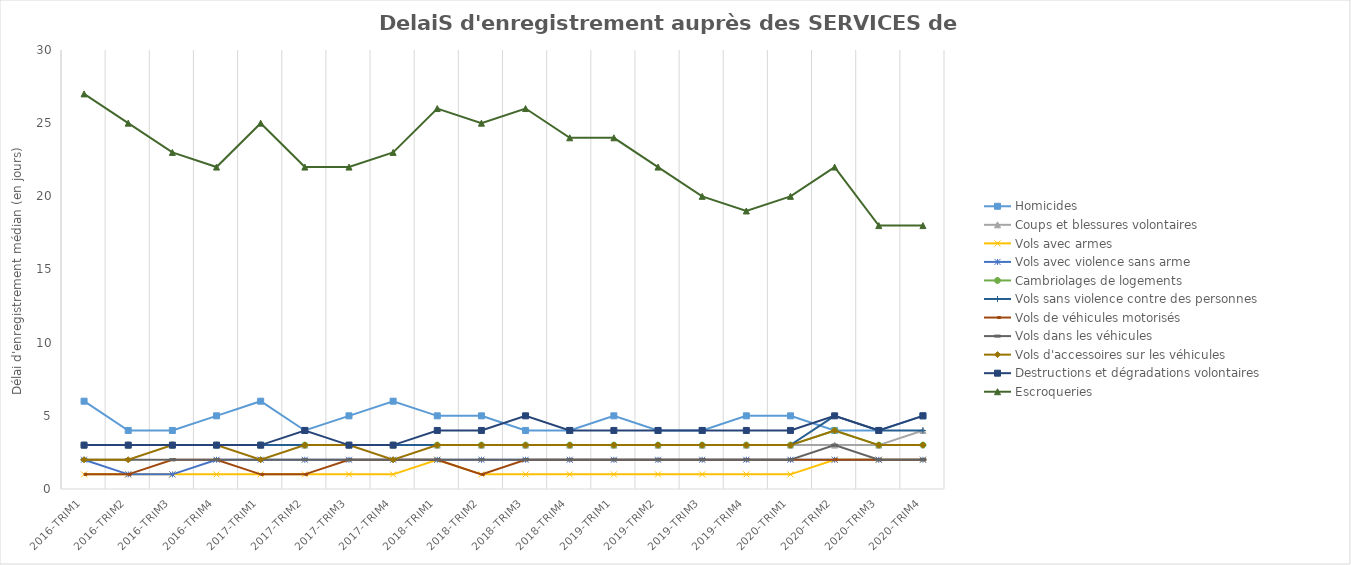
| Category | Homicides | Coups et blessures volontaires | Vols avec armes | Vols avec violence sans arme | Cambriolages de logements | Vols sans violence contre des personnes | Vols de véhicules motorisés | Vols dans les véhicules | Vols d'accessoires sur les véhicules | Destructions et dégradations volontaires | Escroqueries |
|---|---|---|---|---|---|---|---|---|---|---|---|
| 2016-trim1 | 6 | 3 | 1 | 2 | 3 | 3 | 1 | 2 | 2 | 3 | 27 |
| 2016-trim2 | 4 | 3 | 1 | 1 | 3 | 3 | 1 | 2 | 2 | 3 | 25 |
| 2016-trim3 | 4 | 3 | 1 | 1 | 3 | 3 | 2 | 2 | 3 | 3 | 23 |
| 2016-trim4 | 5 | 3 | 1 | 2 | 3 | 3 | 2 | 2 | 3 | 3 | 22 |
| 2017-trim1 | 6 | 3 | 1 | 2 | 3 | 3 | 1 | 2 | 2 | 3 | 25 |
| 2017-trim2 | 4 | 3 | 1 | 2 | 3 | 3 | 1 | 2 | 3 | 4 | 22 |
| 2017-trim3 | 5 | 3 | 1 | 2 | 3 | 3 | 2 | 2 | 3 | 3 | 22 |
| 2017-trim4 | 6 | 3 | 1 | 2 | 3 | 3 | 2 | 2 | 2 | 3 | 23 |
| 2018-trim1 | 5 | 3 | 2 | 2 | 3 | 3 | 2 | 2 | 3 | 4 | 26 |
| 2018-trim2 | 5 | 3 | 1 | 2 | 3 | 3 | 1 | 2 | 3 | 4 | 25 |
| 2018-trim3 | 4 | 3 | 1 | 2 | 3 | 3 | 2 | 2 | 3 | 5 | 26 |
| 2018-trim4 | 4 | 3 | 1 | 2 | 3 | 3 | 2 | 2 | 3 | 4 | 24 |
| 2019-trim1 | 5 | 3 | 1 | 2 | 3 | 3 | 2 | 2 | 3 | 4 | 24 |
| 2019-trim2 | 4 | 3 | 1 | 2 | 3 | 3 | 2 | 2 | 3 | 4 | 22 |
| 2019-trim3 | 4 | 3 | 1 | 2 | 3 | 3 | 2 | 2 | 3 | 4 | 20 |
| 2019-trim4 | 5 | 3 | 1 | 2 | 3 | 3 | 2 | 2 | 3 | 4 | 19 |
| 2020-trim1 | 5 | 3 | 1 | 2 | 3 | 3 | 2 | 2 | 3 | 4 | 20 |
| 2020-trim2 | 4 | 3 | 2 | 2 | 4 | 5 | 2 | 3 | 4 | 5 | 22 |
| 2020-trim3 | 4 | 3 | 2 | 2 | 3 | 4 | 2 | 2 | 3 | 4 | 18 |
| 2020-trim4 | 5 | 4 | 2 | 2 | 3 | 4 | 2 | 2 | 3 | 5 | 18 |